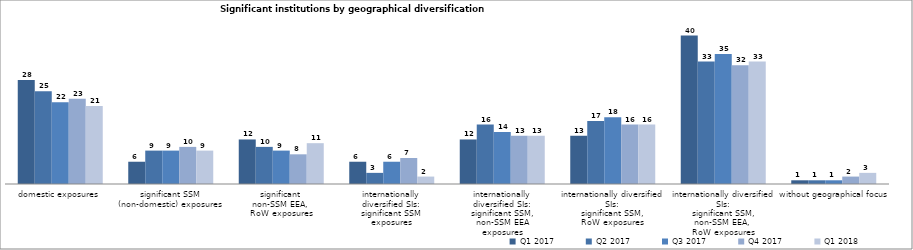
| Category | Q1 2017 | Q2 2017 | Q3 2017 | Q4 2017 | Q1 2018 |
|---|---|---|---|---|---|
| domestic exposures | 28 | 25 | 22 | 23 | 21 |
| significant SSM
(non-domestic) exposures | 6 | 9 | 9 | 10 | 9 |
| significant 
non-SSM EEA, 
RoW exposures | 12 | 10 | 9 | 8 | 11 |
| internationally
diversified SIs:
significant SSM
exposures | 6 | 3 | 6 | 7 | 2 |
| internationally
diversified SIs:
significant SSM,
non-SSM EEA
exposures | 12 | 16 | 14 | 13 | 13 |
| internationally diversified SIs:
significant SSM,
RoW exposures | 13 | 17 | 18 | 16 | 16 |
| internationally diversified SIs:
significant SSM,
non-SSM EEA, 
RoW exposures | 40 | 33 | 35 | 32 | 33 |
| without geographical focus | 1 | 1 | 1 | 2 | 3 |